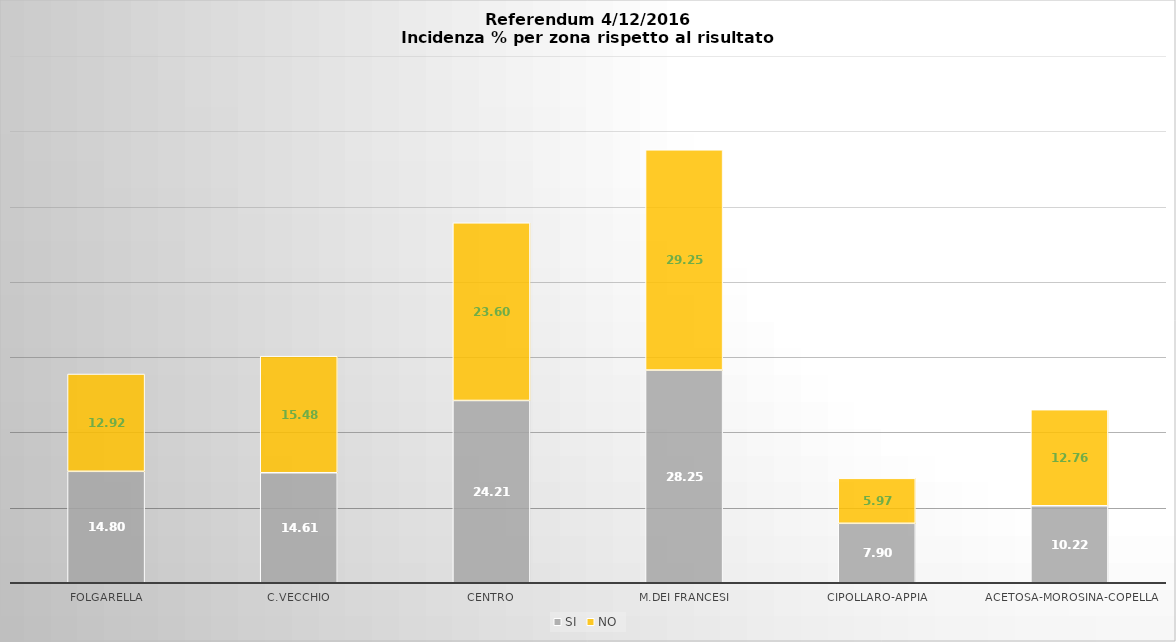
| Category | SI | NO |
|---|---|---|
| Folgarella | 14.802 | 12.924 |
| C.vecchio | 14.615 | 15.483 |
| Centro | 24.21 | 23.601 |
| M.dei Francesi | 28.252 | 29.255 |
| Cipollaro-appia | 7.896 | 5.973 |
| Acetosa-morosina-copella | 10.225 | 12.765 |